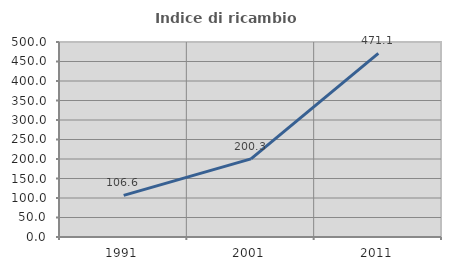
| Category | Indice di ricambio occupazionale  |
|---|---|
| 1991.0 | 106.612 |
| 2001.0 | 200.314 |
| 2011.0 | 471.062 |